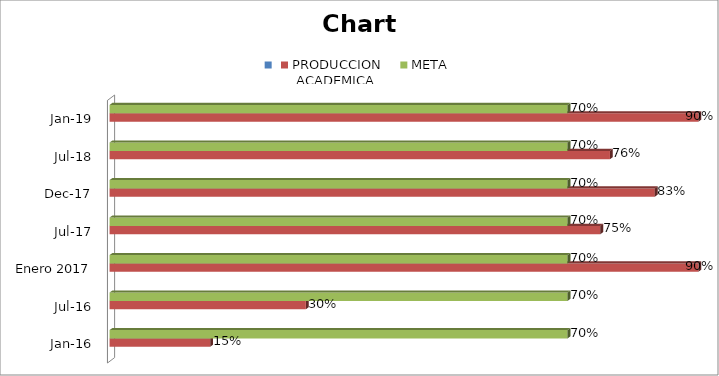
| Category | Series 0 | PRODUCCION
 ACADEMICA | META |
|---|---|---|---|
| ene-16 |  | 0.154 | 0.7 |
| jul-16 |  | 0.3 | 0.7 |
| Enero 2017 |  | 0.9 | 0.7 |
| jul-17 |  | 0.75 | 0.7 |
| dic-17 |  | 0.833 | 0.7 |
| jul-18 |  | 0.765 | 0.7 |
| ene-19 |  | 0.9 | 0.7 |